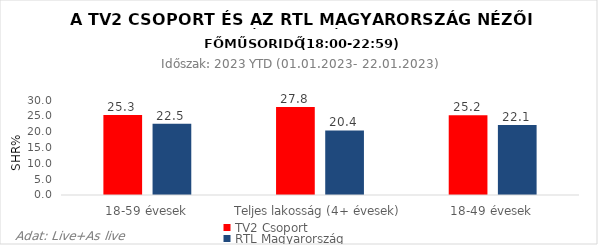
| Category | TV2 Csoport | RTL Magyarország |
|---|---|---|
| 18-59 évesek | 25.3 | 22.5 |
| Teljes lakosság (4+ évesek) | 27.8 | 20.4 |
| 18-49 évesek | 25.2 | 22.1 |